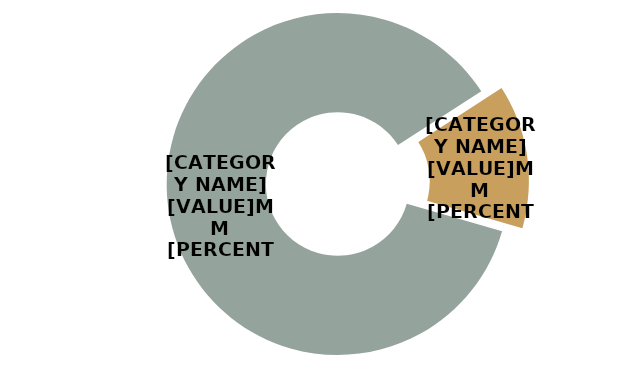
| Category | Series 0 |
|---|---|
| CONVENTIONAL | 103.797 |
| ORGANIC | 16.315 |